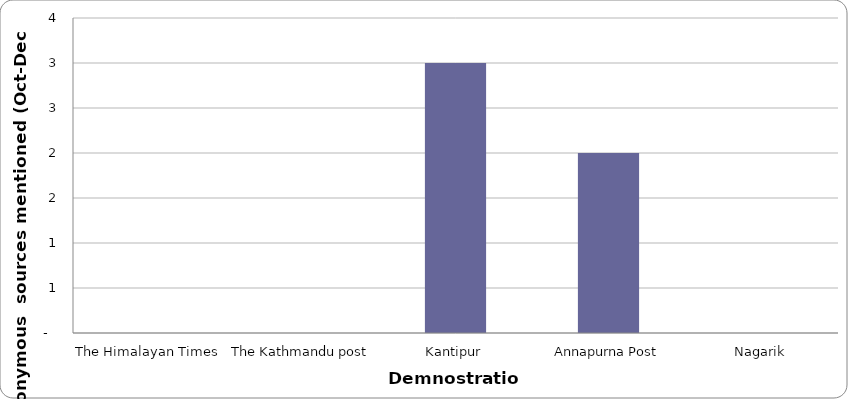
| Category | Demonstration |
|---|---|
| The Himalayan Times | 0 |
| The Kathmandu post | 0 |
| Kantipur | 3 |
| Annapurna Post | 2 |
| Nagarik | 0 |